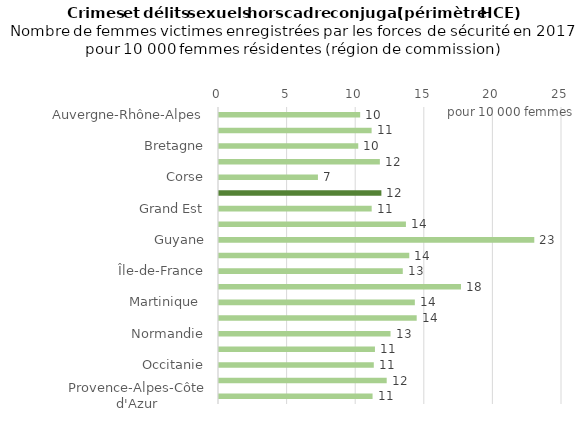
| Category | Series 0 |
|---|---|
| Auvergne-Rhône-Alpes | 10.289 |
| Bourgogne-Franche-Comté | 11.123 |
| Bretagne | 10.15 |
| Centre-Val de Loire | 11.724 |
| Corse | 7.211 |
| France métropolitaine | 11.836 |
| Grand Est | 11.129 |
| Guadeloupe  | 13.624 |
| Guyane | 22.981 |
| Hauts-de-France | 13.868 |
| Île-de-France | 13.395 |
| La Réunion | 17.638 |
| Martinique  | 14.275 |
| Mayotte | 14.409 |
| Normandie | 12.502 |
| Nouvelle-Aquitaine | 11.367 |
| Occitanie | 11.283 |
| Pays de la Loire | 12.224 |
| Provence-Alpes-Côte d'Azur | 11.192 |